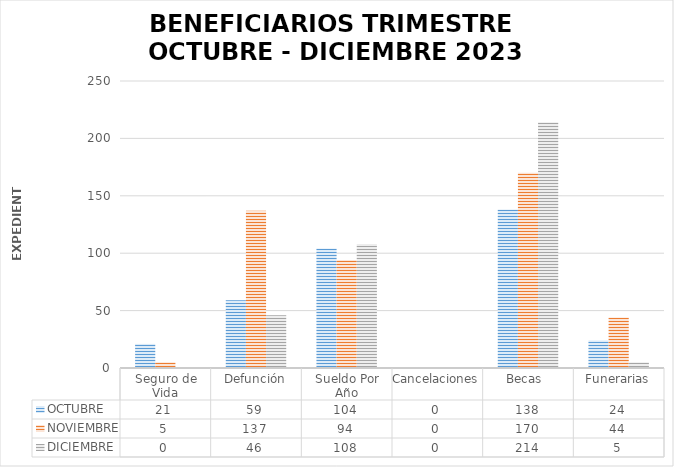
| Category | OCTUBRE | NOVIEMBRE | DICIEMBRE |
|---|---|---|---|
| Seguro de Vida | 21 | 5 | 0 |
| Defunción | 59 | 137 | 46 |
| Sueldo Por Año | 104 | 94 | 108 |
| Cancelaciones | 0 | 0 | 0 |
| Becas  | 138 | 170 | 214 |
| Funerarias | 24 | 44 | 5 |